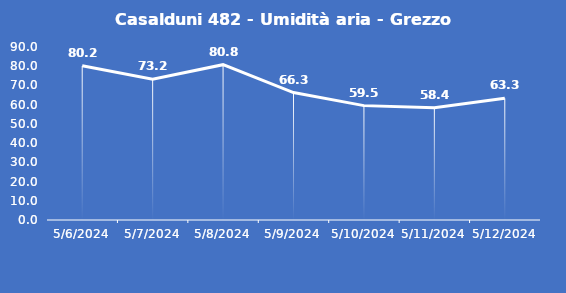
| Category | Casalduni 482 - Umidità aria - Grezzo (%) |
|---|---|
| 5/6/24 | 80.2 |
| 5/7/24 | 73.2 |
| 5/8/24 | 80.8 |
| 5/9/24 | 66.3 |
| 5/10/24 | 59.5 |
| 5/11/24 | 58.4 |
| 5/12/24 | 63.3 |